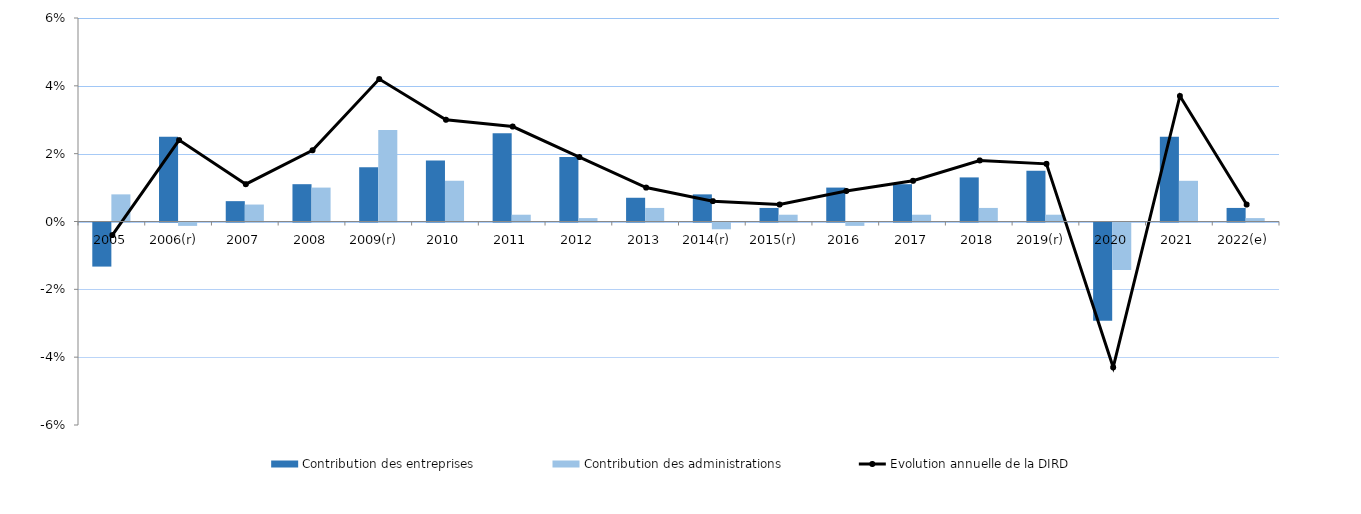
| Category | Contribution des entreprises | Contribution des administrations |
|---|---|---|
| 2005 | -0.013 | 0.008 |
| 2006(r)  | 0.025 | -0.001 |
| 2007 | 0.006 | 0.005 |
| 2008 | 0.011 | 0.01 |
| 2009(r)  | 0.016 | 0.027 |
| 2010 | 0.018 | 0.012 |
| 2011 | 0.026 | 0.002 |
| 2012 | 0.019 | 0.001 |
| 2013 | 0.007 | 0.004 |
| 2014(r)  | 0.008 | -0.002 |
| 2015(r)  | 0.004 | 0.002 |
| 2016 | 0.01 | -0.001 |
| 2017 | 0.011 | 0.002 |
| 2018 | 0.013 | 0.004 |
| 2019(r)  | 0.015 | 0.002 |
| 2020 | -0.029 | -0.014 |
| 2021 | 0.025 | 0.012 |
| 2022(e) | 0.004 | 0.001 |